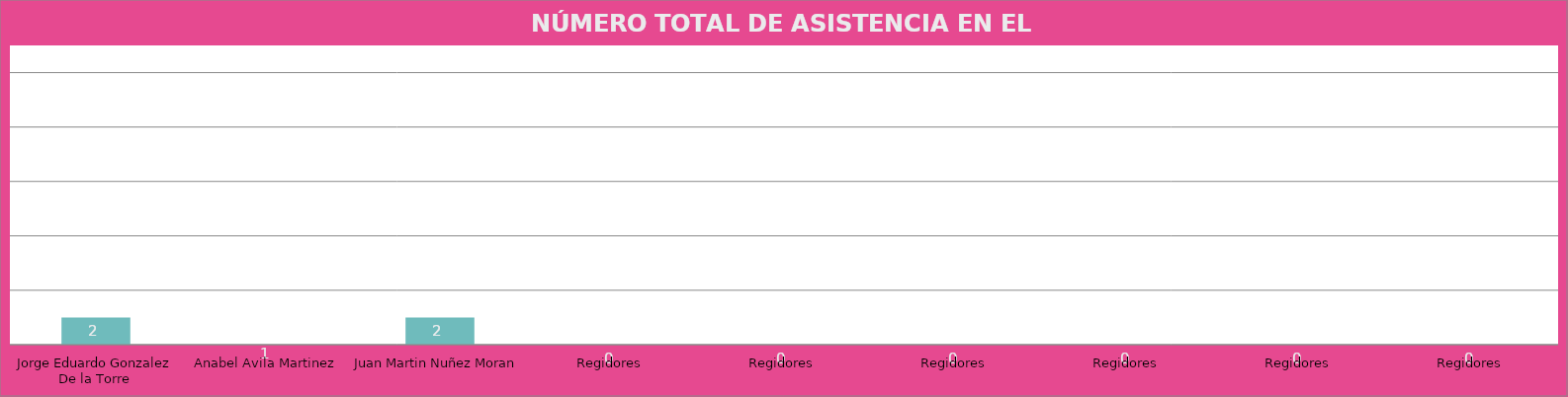
| Category | Jorge Eduardo Gonzalez De la Torre |
|---|---|
| Jorge Eduardo Gonzalez De la Torre | 2 |
| Anabel Avila Martinez | 1 |
| Juan Martin Nuñez Moran | 2 |
| Regidores | 0 |
| Regidores | 0 |
| Regidores | 0 |
| Regidores | 0 |
| Regidores | 0 |
| Regidores | 0 |